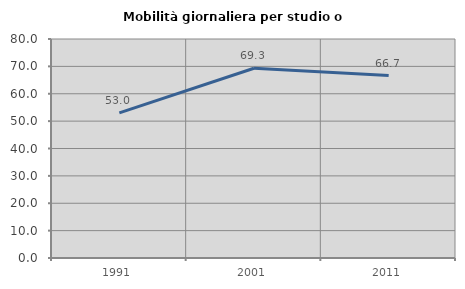
| Category | Mobilità giornaliera per studio o lavoro |
|---|---|
| 1991.0 | 53.015 |
| 2001.0 | 69.318 |
| 2011.0 | 66.667 |